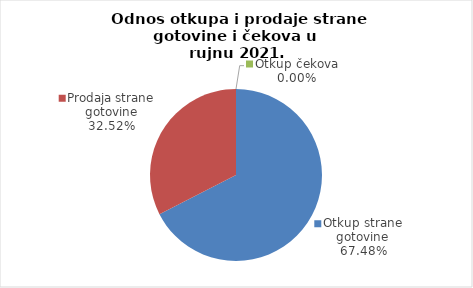
| Category | Series 0 |
|---|---|
| Otkup strane gotovine | 67.475 |
| Prodaja strane gotovine | 32.525 |
| Otkup čekova | 0 |